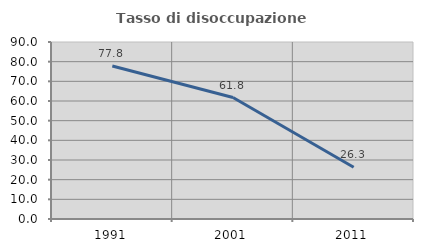
| Category | Tasso di disoccupazione giovanile  |
|---|---|
| 1991.0 | 77.778 |
| 2001.0 | 61.765 |
| 2011.0 | 26.316 |